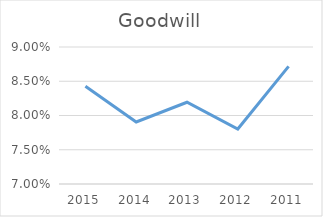
| Category | Goodwill |
|---|---|
| 2015 | 0.084 |
| 2014 | 0.079 |
| 2013 | 0.082 |
| 2012 | 0.078 |
| 2011 | 0.087 |